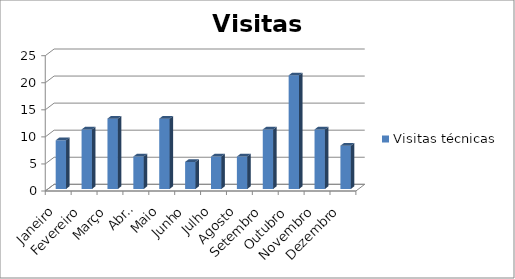
| Category | Visitas técnicas |
|---|---|
| Janeiro | 9 |
| Fevereiro | 11 |
| Março | 13 |
| Abril | 6 |
| Maio | 13 |
| Junho | 5 |
| Julho | 6 |
| Agosto | 6 |
| Setembro | 11 |
| Outubro | 21 |
| Novembro | 11 |
| Dezembro | 8 |